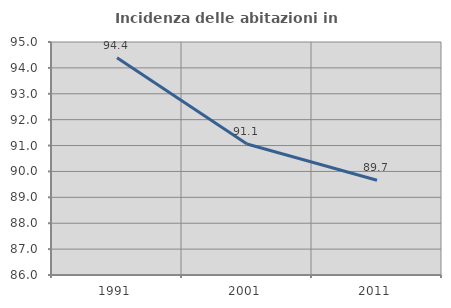
| Category | Incidenza delle abitazioni in proprietà  |
|---|---|
| 1991.0 | 94.388 |
| 2001.0 | 91.059 |
| 2011.0 | 89.662 |